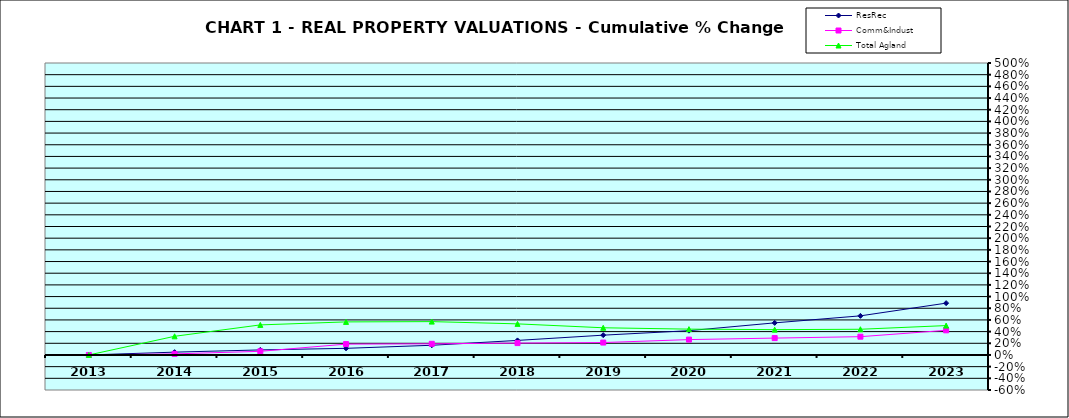
| Category | ResRec | Comm&Indust | Total Agland |
|---|---|---|---|
| 2013.0 | 0 | 0 | 0 |
| 2014.0 | 0.048 | 0.019 | 0.32 |
| 2015.0 | 0.087 | 0.062 | 0.515 |
| 2016.0 | 0.114 | 0.186 | 0.566 |
| 2017.0 | 0.166 | 0.191 | 0.571 |
| 2018.0 | 0.249 | 0.203 | 0.532 |
| 2019.0 | 0.339 | 0.213 | 0.466 |
| 2020.0 | 0.416 | 0.263 | 0.442 |
| 2021.0 | 0.55 | 0.289 | 0.434 |
| 2022.0 | 0.67 | 0.313 | 0.44 |
| 2023.0 | 0.887 | 0.422 | 0.503 |